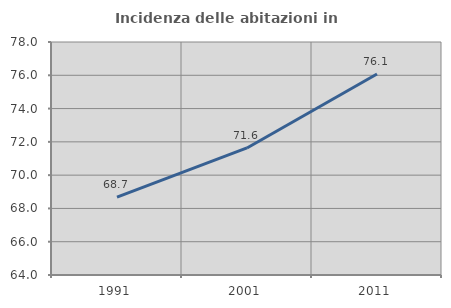
| Category | Incidenza delle abitazioni in proprietà  |
|---|---|
| 1991.0 | 68.683 |
| 2001.0 | 71.633 |
| 2011.0 | 76.081 |